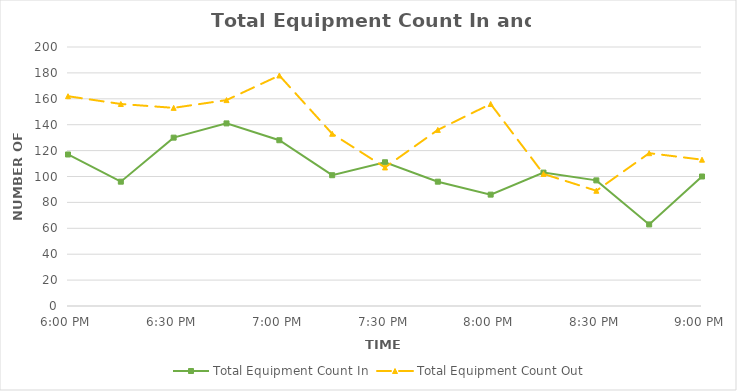
| Category | Total Equipment Count In | Total Equipment Count Out |
|---|---|---|
| 0.75 | 117 | 162 |
| 0.7604166666666666 | 96 | 156 |
| 0.7708333333333334 | 130 | 153 |
| 0.78125 | 141 | 159 |
| 0.7916666666666666 | 128 | 178 |
| 0.8020833333333334 | 101 | 133 |
| 0.8125 | 111 | 107 |
| 0.8229166666666666 | 96 | 136 |
| 0.8333333333333334 | 86 | 156 |
| 0.84375 | 103 | 102 |
| 0.8541666666666666 | 97 | 89 |
| 0.8645833333333334 | 63 | 118 |
| 0.875 | 100 | 113 |